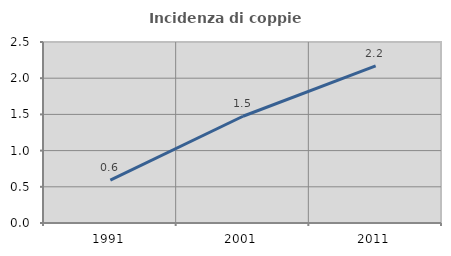
| Category | Incidenza di coppie miste |
|---|---|
| 1991.0 | 0.593 |
| 2001.0 | 1.474 |
| 2011.0 | 2.169 |